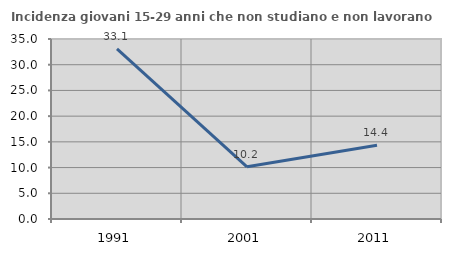
| Category | Incidenza giovani 15-29 anni che non studiano e non lavorano  |
|---|---|
| 1991.0 | 33.071 |
| 2001.0 | 10.156 |
| 2011.0 | 14.36 |